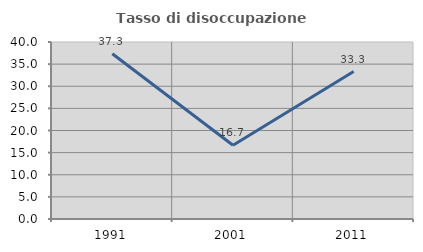
| Category | Tasso di disoccupazione giovanile  |
|---|---|
| 1991.0 | 37.333 |
| 2001.0 | 16.667 |
| 2011.0 | 33.333 |